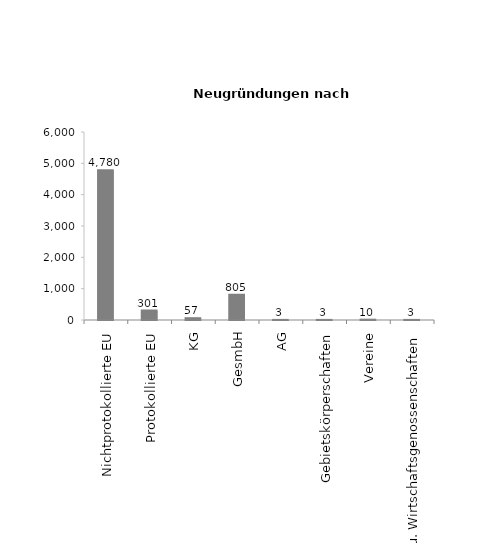
| Category | Series 1 |
|---|---|
| Nichtprotokollierte EU | 4780 |
| Protokollierte EU | 301 |
| KG | 57 |
| GesmbH | 805 |
| AG | 3 |
| Gebietskörperschaften | 3 |
| Vereine | 10 |
| Erwerbs- u. Wirtschaftsgenossenschaften | 3 |